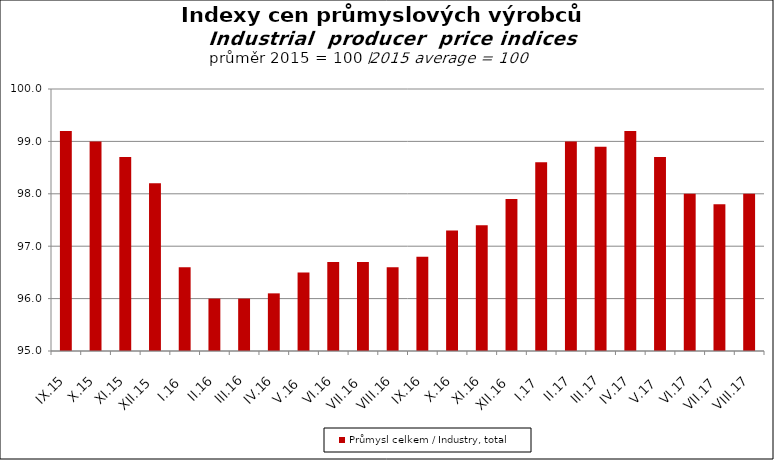
| Category | Průmysl celkem / Industry, total |
|---|---|
| IX.15 | 99.2 |
| X.15 | 99 |
| XI.15 | 98.7 |
| XII.15 | 98.2 |
| I.16 | 96.6 |
| II.16 | 96 |
| III.16 | 96 |
| IV.16 | 96.1 |
| V.16 | 96.5 |
| VI.16 | 96.7 |
| VII.16 | 96.7 |
| VIII.16 | 96.6 |
| IX.16 | 96.8 |
| X.16 | 97.3 |
| XI.16 | 97.4 |
| XII.16 | 97.9 |
| I.17 | 98.6 |
| II.17 | 99 |
| III.17 | 98.9 |
| IV.17 | 99.2 |
| V.17 | 98.7 |
| VI.17 | 98 |
| VII.17 | 97.8 |
| VIII.17 | 98 |